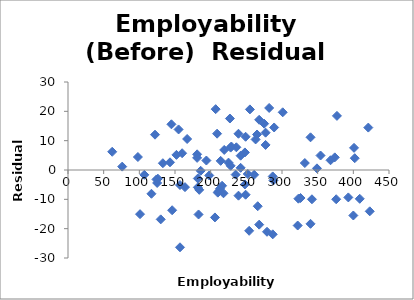
| Category | Series 0 |
|---|---|
| 252.0 | -1.358 |
| 423.0 | -14.088 |
| 101.0 | -15.054 |
| 288.0 | -3.545 |
| 248.0 | 5.988 |
| 145.0 | 15.579 |
| 401.0 | 7.553 |
| 287.0 | -21.927 |
| 275.0 | 15.788 |
| 254.0 | -20.728 |
| 182.0 | -2.89 |
| 117.0 | -8.105 |
| 130.0 | -16.827 |
| 219.0 | 6.836 |
| 152.0 | 5.156 |
| 228.0 | 1.438 |
| 62.0 | 6.215 |
| 393.0 | -9.347 |
| 277.0 | 12.728 |
| 206.0 | -16.171 |
| 229.0 | 8.006 |
| 182.0 | -5.92 |
| 98.0 | 4.429 |
| 125.0 | -4.419 |
| 164.0 | -5.844 |
| 186.0 | -0.27 |
| 235.0 | -1.575 |
| 184.0 | -6.765 |
| 76.0 | 1.155 |
| 126.0 | -2.957 |
| 183.0 | -15.163 |
| 242.0 | 0.742 |
| 207.0 | 20.741 |
| 181.0 | 4.137 |
| 239.0 | -8.755 |
| 216.0 | -5.377 |
| 289.0 | 14.498 |
| 213.0 | -6.368 |
| 209.0 | 12.382 |
| 376.0 | -9.973 |
| 332.0 | 2.373 |
| 249.0 | 11.329 |
| 228.0 | 7.643 |
| 124.0 | -3.217 |
| 194.0 | 3.229 |
| 157.0 | -26.346 |
| 402.0 | 4.025 |
| 323.0 | -9.778 |
| 181.0 | 5.338 |
| 157.0 | -5.121 |
| 266.0 | -12.349 |
| 268.0 | 17.112 |
| 167.0 | 10.573 |
| 342.0 | -9.977 |
| 349.0 | 0.56 |
| 340.0 | 11.148 |
| 227.0 | 17.55 |
| 409.0 | -9.817 |
| 400.0 | -15.51 |
| 374.0 | 4.306 |
| 255.0 | 20.659 |
| 146.0 | -13.718 |
| 248.0 | -4.933 |
| 198.0 | -1.866 |
| 210.0 | -7.721 |
| 107.0 | -1.644 |
| 239.0 | 12.36 |
| 287.0 | -2.192 |
| 340.0 | -18.347 |
| 155.0 | 13.824 |
| 263.0 | 10.424 |
| 265.0 | 12.104 |
| 249.0 | -8.425 |
| 377.0 | 18.449 |
| 301.0 | 19.673 |
| 242.0 | 4.883 |
| 211.0 | -7.309 |
| 160.0 | 5.716 |
| 218.0 | -7.937 |
| 133.0 | 2.315 |
| 122.0 | 12.043 |
| 236.0 | 7.738 |
| 143.0 | 2.625 |
| 354.0 | 4.942 |
| 214.0 | 3.119 |
| 225.0 | 2.515 |
| 261.0 | -1.632 |
| 277.0 | 8.548 |
| 282.0 | 21.151 |
| 322.0 | -18.931 |
| 326.0 | -9.546 |
| 421.0 | 14.457 |
| 368.0 | 3.322 |
| 279.0 | -21.061 |
| 268.0 | -18.623 |